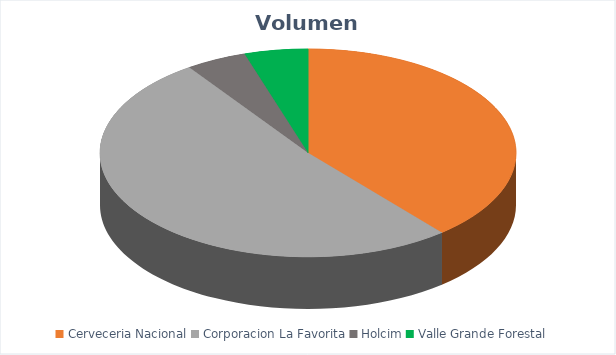
| Category | VOLUMEN ($USD) |
|---|---|
| Cerveceria Nacional | 46184 |
| Corporacion La Favorita | 61158.04 |
| Holcim | 5600 |
| Valle Grande Forestal | 5850 |